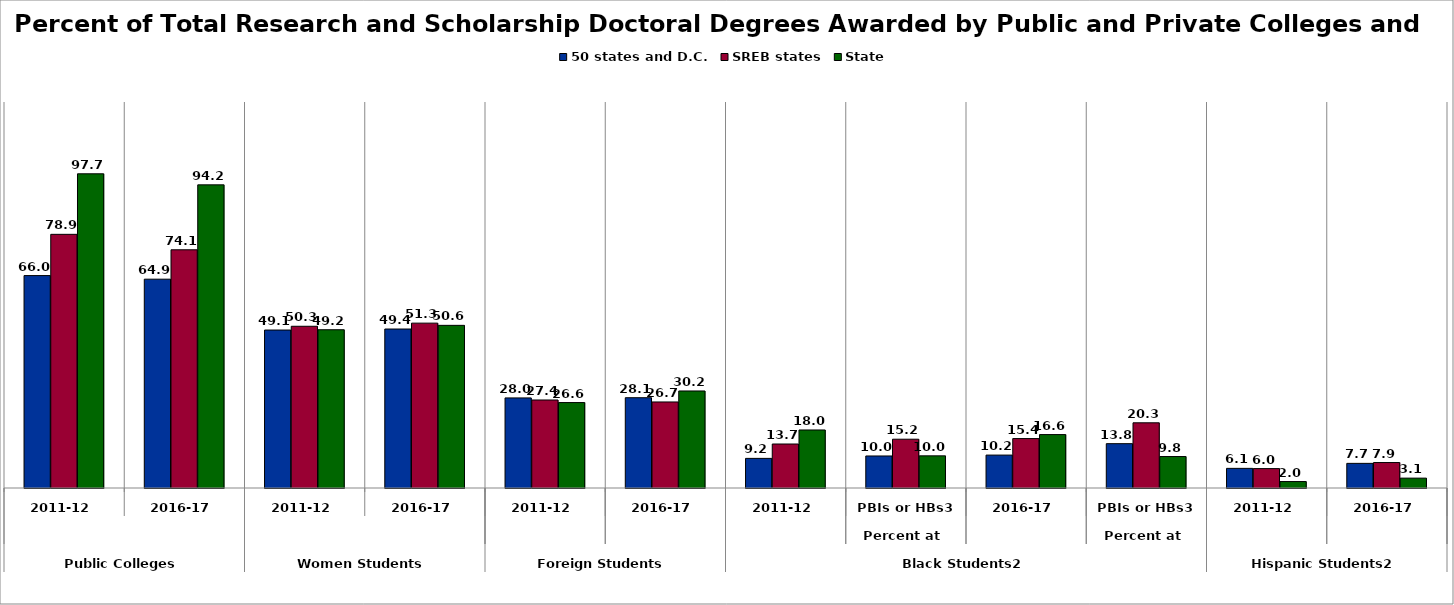
| Category | 50 states and D.C. | SREB states | State |
|---|---|---|---|
| 0 | 66.034 | 78.858 | 97.678 |
| 1 | 64.92 | 74.053 | 94.243 |
| 2 | 49.105 | 50.278 | 49.202 |
| 3 | 49.423 | 51.254 | 50.563 |
| 4 | 28.008 | 27.359 | 26.56 |
| 5 | 28.07 | 26.748 | 30.163 |
| 6 | 9.208 | 13.675 | 18.036 |
| 7 | 9.953 | 15.169 | 10 |
| 8 | 10.233 | 15.368 | 16.606 |
| 9 | 13.782 | 20.266 | 9.783 |
| 10 | 6.102 | 6.032 | 2.004 |
| 11 | 7.658 | 7.913 | 3.069 |